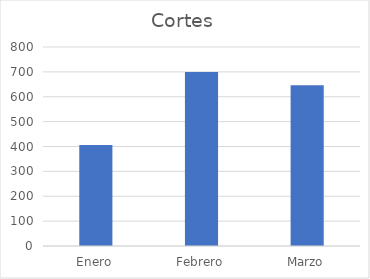
| Category | Cortes |
|---|---|
| Enero | 406 |
| Febrero | 700 |
| Marzo | 646 |